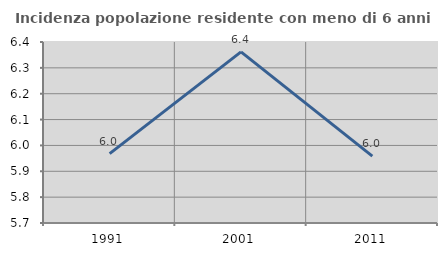
| Category | Incidenza popolazione residente con meno di 6 anni |
|---|---|
| 1991.0 | 5.968 |
| 2001.0 | 6.362 |
| 2011.0 | 5.959 |